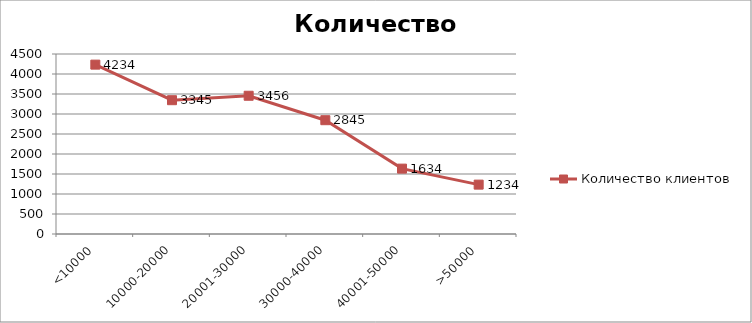
| Category | Количество клиентов |
|---|---|
| <10000 | 4234 |
| 10000-20000 | 3345 |
| 20001-30000 | 3456 |
| 30000-40000 | 2845 |
| 40001-50000 | 1634 |
| >50000 | 1234 |